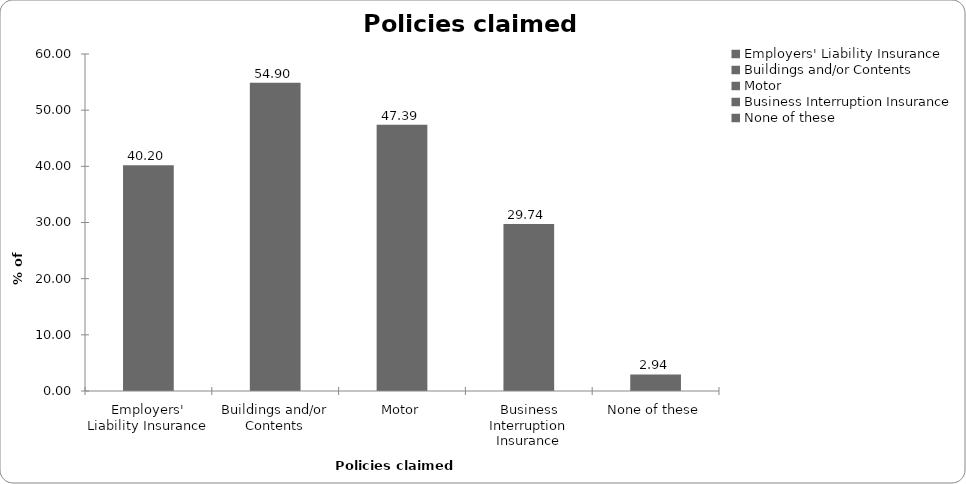
| Category | Series 0 |
|---|---|
| Employers' Liability Insurance | 40.196 |
| Buildings and/or Contents | 54.902 |
| Motor | 47.386 |
| Business Interruption Insurance | 29.739 |
| None of these | 2.941 |